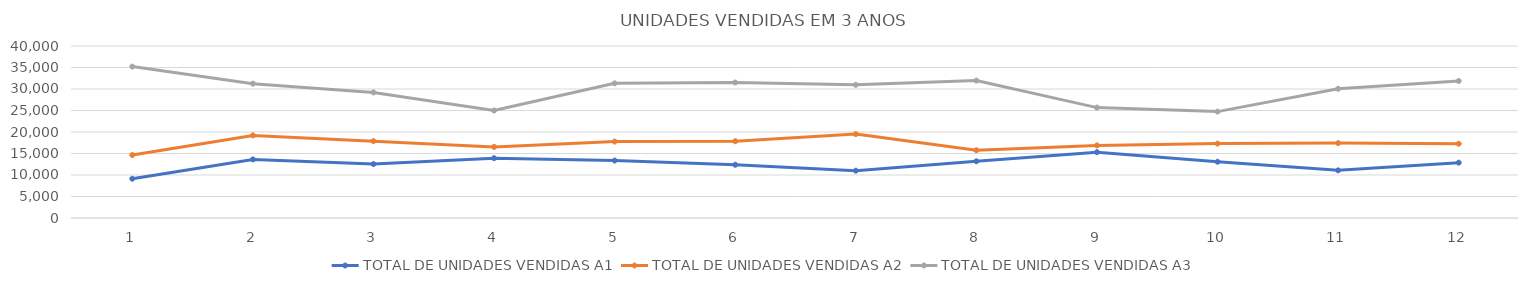
| Category | TOTAL DE UNIDADES VENDIDAS A1 | TOTAL DE UNIDADES VENDIDAS A2 | TOTAL DE UNIDADES VENDIDAS A3 |
|---|---|---|---|
| 0 | 9129 | 14647 | 35215 |
| 1 | 13628 | 19204 | 31243 |
| 2 | 12539 | 17864 | 29198 |
| 3 | 13910 | 16530 | 24992 |
| 4 | 13356 | 17775 | 31314 |
| 5 | 12381 | 17858 | 31508 |
| 6 | 11005 | 19508 | 30973 |
| 7 | 13184 | 15750 | 31959 |
| 8 | 15306 | 16882 | 25671 |
| 9 | 13088 | 17301 | 24743 |
| 10 | 11079 | 17423 | 30043 |
| 11 | 12870 | 17275 | 31855 |